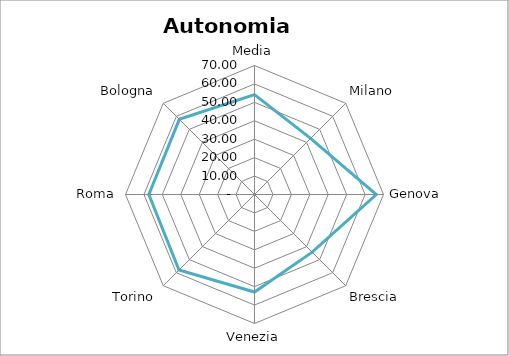
| Category | Autonomia impositiva |
|---|---|
| Media | 54.181 |
| Milano | 43.04 |
| Genova | 66.11 |
| Brescia | 44.27 |
| Venezia | 52.9 |
| Torino | 57.94 |
| Roma | 57.32 |
| Bologna | 57.69 |